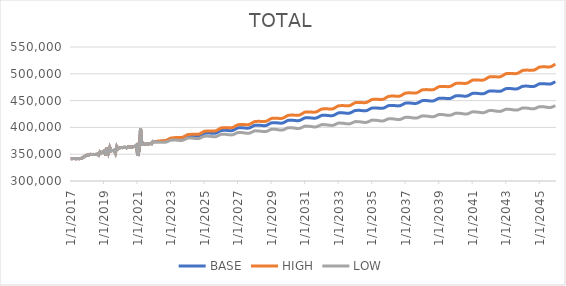
| Category | BASE | HIGH | LOW |
|---|---|---|---|
| 1/1/17 | 341414 | 341414 | 341414 |
| 2/1/17 | 341582 | 341582 | 341582 |
| 3/1/17 | 342098 | 342098 | 342098 |
| 4/1/17 | 341754 | 341754 | 341754 |
| 5/1/17 | 341351 | 341351 | 341351 |
| 6/1/17 | 341951 | 341951 | 341951 |
| 7/1/17 | 341513 | 341513 | 341513 |
| 8/1/17 | 342066 | 342066 | 342066 |
| 9/1/17 | 342562 | 342562 | 342562 |
| 10/1/17 | 344309 | 344309 | 344309 |
| 11/1/17 | 346057 | 346057 | 346057 |
| 12/1/17 | 347147 | 347147 | 347147 |
| 1/1/18 | 348705 | 348705 | 348705 |
| 2/1/18 | 348555 | 348555 | 348555 |
| 3/1/18 | 349740 | 349740 | 349740 |
| 4/1/18 | 349401 | 349401 | 349401 |
| 5/1/18 | 349702 | 349702 | 349702 |
| 6/1/18 | 349418 | 349418 | 349418 |
| 7/1/18 | 349708 | 349708 | 349708 |
| 8/1/18 | 350136 | 350136 | 350136 |
| 9/1/18 | 348254 | 348254 | 348254 |
| 10/1/18 | 354458 | 354458 | 354458 |
| 11/1/18 | 352362 | 352362 | 352362 |
| 12/1/18 | 354728.273 | 354728.273 | 354728.273 |
| 1/1/19 | 356267 | 356267 | 356267 |
| 2/1/19 | 347960 | 347960 | 347960 |
| 3/1/19 | 362067 | 362067 | 362067 |
| 4/1/19 | 352798 | 352798 | 352798 |
| 5/1/19 | 362711 | 362711 | 362711 |
| 6/1/19 | 356136 | 356136 | 356136 |
| 7/1/19 | 356922 | 356922 | 356922 |
| 8/1/19 | 357506 | 357506 | 357506 |
| 9/1/19 | 352009 | 352009 | 352009 |
| 10/1/19 | 364300 | 364300 | 364300 |
| 11/1/19 | 360032 | 360032 | 360032 |
| 12/1/19 | 361445 | 361445 | 361445 |
| 1/1/20 | 362653 | 362653 | 362653 |
| 2/1/20 | 362205 | 362205 | 362205 |
| 3/1/20 | 362824 | 362824 | 362824 |
| 4/1/20 | 362974 | 362974 | 362974 |
| 5/1/20 | 361790 | 361790 | 361790 |
| 6/1/20 | 363908 | 363908 | 363908 |
| 7/1/20 | 363529 | 363529 | 363529 |
| 8/1/20 | 363593 | 363593 | 363593 |
| 9/1/20 | 363024 | 363024 | 363024 |
| 10/1/20 | 364200 | 364200 | 364200 |
| 11/1/20 | 364655 | 364655 | 364655 |
| 12/1/20 | 366796 | 366796 | 366796 |
| 1/1/21 | 346820.667 | 346820.667 | 346820.667 |
| 2/1/21 | 357845.667 | 357845.667 | 357845.667 |
| 3/1/21 | 398262.667 | 398262.667 | 398262.667 |
| 4/1/21 | 368419 | 368419 | 368419 |
| 5/1/21 | 367947 | 367947 | 367947 |
| 6/1/21 | 368967 | 368967 | 368967 |
| 7/1/21 | 368718 | 368718 | 368718 |
| 8/1/21 | 369034 | 369034 | 369034 |
| 9/1/21 | 369008 | 369008 | 369008 |
| 10/1/21 | 370222 | 370222 | 370222 |
| 11/1/21 | 369350 | 369350 | 369350 |
| 12/1/21 | 373803 | 373803 | 373803 |
| 1/1/22 | 373133.5 | 373133.5 | 373133.5 |
| 2/1/22 | 373162.5 | 373162.5 | 373162.5 |
| 3/1/22 | 373470.167 | 374216.193 | 372347.744 |
| 4/1/22 | 373796.427 | 374626.585 | 372547.515 |
| 5/1/22 | 373851.375 | 374765.947 | 372477.992 |
| 6/1/22 | 374037.883 | 375036.261 | 372537.887 |
| 7/1/22 | 373970.024 | 375052.668 | 372345.532 |
| 8/1/22 | 374041.579 | 375206.751 | 372289.741 |
| 9/1/22 | 374205.28 | 375453.565 | 372325.433 |
| 10/1/22 | 375318.473 | 376656.25 | 373308.65 |
| 11/1/22 | 376446.98 | 377873.654 | 374306.651 |
| 12/1/22 | 377803.884 | 379320.353 | 375529.693 |
| 1/1/23 | 378685.656 | 380290.779 | 376279.505 |
| 2/1/23 | 378755.328 | 380445.568 | 376222.46 |
| 3/1/23 | 379025.191 | 380802.195 | 376363.599 |
| 4/1/23 | 379146.206 | 381008.42 | 376356.531 |
| 5/1/23 | 379103.931 | 381051.451 | 376188.385 |
| 6/1/23 | 378934.975 | 380966.514 | 375893.281 |
| 7/1/23 | 378842.065 | 380927.054 | 375726.708 |
| 8/1/23 | 378881.929 | 381051.468 | 375637.76 |
| 9/1/23 | 379192.487 | 381448.757 | 375817.094 |
| 10/1/23 | 380299.033 | 382648.851 | 376788.299 |
| 11/1/23 | 381633.201 | 384077.493 | 377984.619 |
| 12/1/23 | 383091.776 | 385631.745 | 379302.265 |
| 1/1/24 | 383967.878 | 386599.967 | 380041.899 |
| 2/1/24 | 384062.076 | 386780.961 | 380007.704 |
| 3/1/24 | 384305.309 | 387112.803 | 380119.326 |
| 4/1/24 | 384376.314 | 387270.679 | 380060.768 |
| 5/1/24 | 384237.635 | 387217.909 | 379796.258 |
| 6/1/24 | 384020.824 | 387086.201 | 379452.872 |
| 7/1/24 | 383874.007 | 386994.051 | 379231.654 |
| 8/1/24 | 383936.571 | 387143.386 | 379163.223 |
| 9/1/24 | 384271.777 | 387568.011 | 379364.331 |
| 10/1/24 | 385422.033 | 388816.554 | 380373.284 |
| 11/1/24 | 386812.974 | 390307.196 | 381619.63 |
| 12/1/24 | 388315.719 | 391911.214 | 382974.304 |
| 1/1/25 | 389190.56 | 392881.725 | 383708.318 |
| 2/1/25 | 389298.051 | 393077.853 | 383685.706 |
| 3/1/25 | 389493.274 | 393363.214 | 383749.063 |
| 4/1/25 | 389528.247 | 393486.796 | 383653.027 |
| 5/1/25 | 389339.886 | 393385.096 | 383338.722 |
| 6/1/25 | 389092.724 | 393224.039 | 382964.688 |
| 7/1/25 | 388925.951 | 393113.259 | 382722.606 |
| 8/1/25 | 388976.503 | 393252.293 | 382640.575 |
| 9/1/25 | 389338.021 | 393706.153 | 382864.781 |
| 10/1/25 | 390522.769 | 394994.132 | 383901.995 |
| 11/1/25 | 391929.311 | 396505.219 | 385157.623 |
| 12/1/25 | 393432.283 | 398114.573 | 386506.067 |
| 1/1/26 | 394328.758 | 399110.848 | 387256.644 |
| 2/1/26 | 394406.804 | 399278.759 | 387203.752 |
| 3/1/26 | 394576.154 | 399539.913 | 387239.842 |
| 4/1/26 | 394563.062 | 399616.652 | 387095.034 |
| 5/1/26 | 394371.723 | 399513.266 | 386776.926 |
| 6/1/26 | 394077.657 | 399305.566 | 386356.651 |
| 7/1/26 | 393903.818 | 399189.311 | 386106.306 |
| 8/1/26 | 393927.307 | 399302.633 | 385996.149 |
| 9/1/26 | 394294.859 | 399765.363 | 386223.396 |
| 10/1/26 | 395464.723 | 401042.636 | 387240.58 |
| 11/1/26 | 396855.066 | 402541.964 | 388474.362 |
| 12/1/26 | 398338.285 | 404136.42 | 389797.051 |
| 1/1/27 | 399224.477 | 405126.129 | 390532.971 |
| 2/1/27 | 399256.87 | 405249.115 | 390434.31 |
| 3/1/27 | 399394.006 | 405479.518 | 390437.138 |
| 4/1/27 | 399332.016 | 405508.188 | 390243.297 |
| 5/1/27 | 399097.599 | 405361.992 | 389882.692 |
| 6/1/27 | 398767.569 | 405118.565 | 389427.213 |
| 7/1/27 | 398592.755 | 405002.777 | 389174.844 |
| 8/1/27 | 398629.231 | 405131.041 | 389075.852 |
| 9/1/27 | 398997.754 | 405597.316 | 389301.414 |
| 10/1/27 | 400171.616 | 406883.015 | 390317.141 |
| 11/1/27 | 401579.028 | 408404.513 | 391561.528 |
| 12/1/27 | 403071.151 | 410013.315 | 392886.422 |
| 1/1/28 | 403939.562 | 410988.55 | 393600.735 |
| 2/1/28 | 403970.799 | 411111.877 | 393499.793 |
| 3/1/28 | 404095.087 | 411331.017 | 393489.073 |
| 4/1/28 | 404025.004 | 411353.005 | 393286.175 |
| 5/1/28 | 403768.638 | 411185.243 | 392903.523 |
| 6/1/28 | 403449.569 | 410953.912 | 392458.553 |
| 7/1/28 | 403262.768 | 410827.2 | 392193.707 |
| 8/1/28 | 403303.258 | 410961.246 | 392097.135 |
| 9/1/28 | 403672.775 | 411431.013 | 392321.159 |
| 10/1/28 | 404858.628 | 412733.465 | 393343.087 |
| 11/1/28 | 406268.032 | 414261.794 | 394583.396 |
| 12/1/28 | 407760.188 | 415875.848 | 395901.965 |
| 1/1/29 | 408617.476 | 416843.388 | 396601.742 |
| 2/1/29 | 408647.762 | 416967.204 | 396498.797 |
| 3/1/29 | 408758.984 | 417174.673 | 396474.031 |
| 4/1/29 | 408687.963 | 417197.286 | 396269.084 |
| 5/1/29 | 408429.559 | 417028.261 | 395883.766 |
| 6/1/29 | 408105.513 | 416792.573 | 395434.044 |
| 7/1/29 | 407918.694 | 416667.195 | 395168.27 |
| 8/1/29 | 407960.19 | 416803.897 | 395071.34 |
| 9/1/29 | 408333.712 | 417280.437 | 395296.54 |
| 10/1/29 | 409519.565 | 418587.374 | 396313.102 |
| 11/1/29 | 410922.964 | 420114.302 | 397541.72 |
| 12/1/29 | 412404.116 | 421722.218 | 398843.457 |
| 1/1/30 | 413264.605 | 422696.806 | 399542.505 |
| 2/1/30 | 413281.875 | 422808.604 | 399426.108 |
| 3/1/30 | 413388.118 | 423012.677 | 399395.176 |
| 4/1/30 | 413307.068 | 423026.384 | 399179.653 |
| 5/1/30 | 413051.69 | 422861.322 | 398797.052 |
| 6/1/30 | 412715.628 | 422613.9 | 398335.962 |
| 7/1/30 | 412539.821 | 422501.326 | 398079.783 |
| 8/1/30 | 412581.307 | 422639.752 | 397981.364 |
| 9/1/30 | 412959.832 | 423124.202 | 398208.164 |
| 10/1/30 | 414146.686 | 424436.693 | 399220.796 |
| 11/1/30 | 415551.087 | 425969.537 | 400444.421 |
| 12/1/30 | 417033.236 | 427583.761 | 401740.81 |
| 1/1/31 | 417891.799 | 428560.167 | 402433.674 |
| 2/1/31 | 417905.075 | 428669.244 | 402312.504 |
| 3/1/31 | 418013.311 | 428877.126 | 402282.126 |
| 4/1/31 | 417931.271 | 428891.28 | 402064.675 |
| 5/1/31 | 417672.881 | 428723.92 | 401679.036 |
| 6/1/31 | 417343.829 | 428484.514 | 401224.712 |
| 7/1/31 | 417164.015 | 428369.214 | 400963.8 |
| 8/1/31 | 417211.507 | 428515.647 | 400869.616 |
| 9/1/31 | 417587.028 | 428999.677 | 401090.379 |
| 10/1/31 | 418772.883 | 430315.776 | 402097.142 |
| 11/1/31 | 420179.284 | 431855.608 | 403316.721 |
| 12/1/31 | 421660.434 | 433474.156 | 404605.829 |
| 1/1/32 | 422515.997 | 434451.166 | 405291.668 |
| 2/1/32 | 422531.271 | 434563.739 | 405171.466 |
| 3/1/32 | 422637.51 | 434771.299 | 405137.821 |
| 4/1/32 | 422555.467 | 434786.993 | 404919.338 |
| 5/1/32 | 422297.081 | 434620.385 | 404533.651 |
| 6/1/32 | 421975.024 | 434389.074 | 404085.14 |
| 7/1/32 | 421791.214 | 434271.082 | 403819.534 |
| 8/1/32 | 421833.703 | 434414.111 | 403719.187 |
| 9/1/32 | 422209.227 | 434900.867 | 403937.408 |
| 10/1/32 | 423395.08 | 436221.6 | 404938.833 |
| 11/1/32 | 424796.481 | 437761.209 | 406147.723 |
| 12/1/32 | 426276.632 | 439384.048 | 407429.745 |
| 1/1/33 | 427129.241 | 440361.705 | 408108.701 |
| 2/1/33 | 427144.515 | 440475.712 | 407987.588 |
| 3/1/33 | 427244.753 | 440678.757 | 407946.994 |
| 4/1/33 | 427163.711 | 440696.963 | 407728.597 |
| 5/1/33 | 426906.324 | 440532.268 | 407343.674 |
| 6/1/33 | 426577.269 | 440294.445 | 406889.488 |
| 7/1/33 | 426400.457 | 440185.244 | 406629.586 |
| 8/1/33 | 426439.947 | 440327.002 | 406524.913 |
| 9/1/33 | 426815.469 | 440816.607 | 406740.389 |
| 10/1/33 | 427999.324 | 442139.939 | 407734.537 |
| 11/1/33 | 429400.724 | 443684.475 | 408937.616 |
| 12/1/33 | 430876.875 | 445308.452 | 410209.736 |
| 1/1/34 | 431730.633 | 446291.189 | 410885.516 |
| 2/1/34 | 431745.908 | 446406.576 | 410763.544 |
| 3/1/34 | 431847.146 | 446612.402 | 410722.608 |
| 4/1/34 | 431762.103 | 446627.964 | 410499.441 |
| 5/1/34 | 431506.717 | 446466.239 | 410116.251 |
| 6/1/34 | 431174.661 | 446226.141 | 409659.301 |
| 7/1/34 | 430995.85 | 446116.378 | 409396.542 |
| 8/1/34 | 431037.34 | 446262.059 | 409292.279 |
| 9/1/34 | 431409.862 | 446751.372 | 409502.278 |
| 10/1/34 | 432589.716 | 448075.169 | 410487.404 |
| 11/1/34 | 433987.117 | 449620.52 | 411680.856 |
| 12/1/34 | 435465.267 | 451251.95 | 412948.666 |
| 1/1/35 | 436316.969 | 452236.347 | 413618.414 |
| 2/1/35 | 436326.244 | 452346.923 | 413489.899 |
| 3/1/35 | 436428.482 | 452555.56 | 413448.563 |
| 4/1/35 | 436343.44 | 452572.608 | 413224.504 |
| 5/1/35 | 436082.053 | 452405.474 | 412835.58 |
| 6/1/35 | 435750.998 | 452167.282 | 412379.574 |
| 7/1/35 | 435571.186 | 452057.964 | 412114.981 |
| 8/1/35 | 435611.676 | 452204.484 | 412008.324 |
| 9/1/35 | 435982.198 | 452694.508 | 412213.822 |
| 10/1/35 | 437162.053 | 454023.009 | 413193.674 |
| 11/1/35 | 438561.453 | 455575.423 | 414383.199 |
| 12/1/35 | 440036.604 | 457209.1 | 415642.163 |
| 1/1/36 | 440885.645 | 458194.465 | 416305.337 |
| 2/1/36 | 440896.932 | 458308.543 | 416177.833 |
| 3/1/36 | 440996.218 | 458515.871 | 416132.54 |
| 4/1/36 | 440915.067 | 458538.531 | 415911.19 |
| 5/1/36 | 440649.916 | 458368.315 | 415518.634 |
| 6/1/36 | 440321.23 | 458133.436 | 415064.923 |
| 7/1/36 | 440137.418 | 458021.454 | 414795.675 |
| 8/1/36 | 440175.908 | 458167.782 | 414685.691 |
| 9/1/36 | 440546.431 | 458660.604 | 414888.663 |
| 10/1/36 | 441726.285 | 459993.848 | 415863.215 |
| 11/1/36 | 443120.686 | 461545.958 | 417042.367 |
| 12/1/36 | 444597.483 | 463186.819 | 418296.778 |
| 1/1/37 | 445442.469 | 464171.744 | 418952.121 |
| 2/1/37 | 445453.755 | 464287.232 | 418823.82 |
| 3/1/37 | 445553.041 | 464496.288 | 418777.25 |
| 4/1/37 | 445468.89 | 464517.37 | 418552.216 |
| 5/1/37 | 445205.739 | 464350.238 | 418161.27 |
| 6/1/37 | 444872.588 | 464111.463 | 417703.554 |
| 7/1/37 | 444687.581 | 463999.805 | 417432.329 |
| 8/1/37 | 444726.072 | 464147.941 | 417320.977 |
| 9/1/37 | 445093.594 | 464640.429 | 417518.62 |
| 10/1/37 | 446271.448 | 465976.335 | 418486.098 |
| 11/1/37 | 447664.207 | 467531.75 | 419657.977 |
| 12/1/37 | 449138.306 | 469175.114 | 420903.878 |
| 1/1/38 | 449985.267 | 470165.987 | 421557.107 |
| 2/1/38 | 449992.553 | 470278.694 | 421424.298 |
| 3/1/38 | 450089.839 | 470487.399 | 421374.577 |
| 4/1/38 | 450003.688 | 470507.889 | 421146.921 |
| 5/1/38 | 449738.537 | 470339.525 | 420754.036 |
| 6/1/38 | 449405.386 | 470101.625 | 420296.402 |
| 7/1/38 | 449219.61 | 469990.756 | 420023.482 |
| 8/1/38 | 449253.209 | 470135.609 | 419906.234 |
| 9/1/38 | 449623.683 | 470634.138 | 420103.983 |
| 10/1/38 | 450800.656 | 471973.804 | 421065.54 |
| 11/1/38 | 452195.005 | 473535.899 | 422233.289 |
| 12/1/38 | 453668.104 | 475183.747 | 423472.254 |
| 1/1/39 | 454515.192 | 476178.603 | 424121.513 |
| 2/1/39 | 454520.479 | 476290.648 | 423985.979 |
| 3/1/39 | 454619.765 | 476503.291 | 423936.982 |
| 4/1/39 | 454529.614 | 476521.136 | 423704.683 |
| 5/1/39 | 454265.463 | 476354.716 | 423312.658 |
| 6/1/39 | 453931.312 | 476116.687 | 422854.161 |
| 7/1/39 | 453743.535 | 476005.156 | 422578.69 |
| 8/1/39 | 453779.134 | 476154.042 | 422461.884 |
| 9/1/39 | 454142.608 | 476647.956 | 422650.749 |
| 10/1/39 | 455317.582 | 477990.244 | 423605.347 |
| 11/1/39 | 456707.931 | 479553.146 | 424763.76 |
| 12/1/39 | 458179.03 | 481204.186 | 425995.115 |
| 1/1/40 | 459023.192 | 482199.792 | 426637.732 |
| 2/1/40 | 459029.478 | 482314.327 | 426502.341 |
| 3/1/40 | 459122.764 | 482522.389 | 426446.62 |
| 4/1/40 | 459031.613 | 482540.678 | 426212.565 |
| 5/1/40 | 458765.462 | 482372.957 | 425818.71 |
| 6/1/40 | 458428.311 | 482132.587 | 425357.599 |
| 7/1/40 | 458239.535 | 482021.633 | 425080.267 |
| 8/1/40 | 458273.134 | 482170.259 | 424960.271 |
| 9/1/40 | 458637.607 | 482668.134 | 425147.615 |
| 10/1/40 | 459811.581 | 484014.072 | 426096.26 |
| 11/1/40 | 461202.93 | 485583.121 | 427249.944 |
| 12/1/40 | 462671.029 | 487236.492 | 428472.601 |
| 1/1/41 | 463514.244 | 488234.891 | 429110.522 |
| 2/1/41 | 463520.531 | 488350.874 | 428974.388 |
| 3/1/41 | 463613.817 | 488560.739 | 428917.492 |
| 4/1/41 | 463526.666 | 488584.936 | 428686.229 |
| 5/1/41 | 463257.515 | 488414.894 | 428289.542 |
| 6/1/41 | 462919.363 | 488174.33 | 427827.657 |
| 7/1/41 | 462730.587 | 488065.013 | 427549.418 |
| 8/1/41 | 462764.186 | 488215.597 | 427428.107 |
| 9/1/41 | 463126.66 | 488714.259 | 427611.107 |
| 10/1/41 | 464298.634 | 490062.996 | 428552.693 |
| 11/1/41 | 465689.983 | 491637.095 | 429700.873 |
| 12/1/41 | 467158.082 | 493296.038 | 430917.611 |
| 1/1/42 | 468001.11 | 494298.25 | 431551.307 |
| 2/1/42 | 468005.396 | 494413.606 | 431412.51 |
| 3/1/42 | 468100.682 | 494627.437 | 431356.271 |
| 4/1/42 | 468007.531 | 494646.903 | 431118.579 |
| 5/1/42 | 467739.38 | 494478.959 | 430722.727 |
| 6/1/42 | 467400.229 | 494238.207 | 430260.031 |
| 7/1/42 | 467211.453 | 494130.558 | 429980.985 |
| 8/1/42 | 467247.052 | 494285.264 | 429860.054 |
| 9/1/42 | 467613.526 | 494791.135 | 430044.221 |
| 10/1/42 | 468787.499 | 496146.889 | 430982.569 |
| 11/1/42 | 470177.848 | 497725.052 | 432124.186 |
| 12/1/42 | 471648.947 | 499392.707 | 433337.853 |
| 1/1/43 | 472494.15 | 500401.264 | 433969.541 |
| 2/1/43 | 472498.436 | 500518.175 | 433829.896 |
| 3/1/43 | 472595.722 | 500736.03 | 433774.256 |
| 4/1/43 | 472506.571 | 500761.362 | 433539.434 |
| 5/1/43 | 472241.42 | 500597.584 | 433146.132 |
| 6/1/43 | 471904.269 | 500360.026 | 432685.312 |
| 7/1/43 | 471714.493 | 500252.804 | 432404.617 |
| 8/1/43 | 471746.092 | 500405.215 | 432278.657 |
| 9/1/43 | 472110.566 | 500911.825 | 432458.655 |
| 10/1/43 | 473282.539 | 502270.228 | 433390.16 |
| 11/1/43 | 474673.888 | 503854.646 | 434527.191 |
| 12/1/43 | 476143.987 | 505526.752 | 435734.198 |
| 1/1/44 | 476985.059 | 506534.747 | 436358.399 |
| 2/1/44 | 476990.345 | 506654.204 | 436218.945 |
| 3/1/44 | 477082.632 | 506868.548 | 436157.604 |
| 4/1/44 | 476990.48 | 506892.319 | 435919.217 |
| 5/1/44 | 476725.329 | 506729.449 | 435525.859 |
| 6/1/44 | 476385.178 | 506489.498 | 435062.626 |
| 7/1/44 | 476204.402 | 506394.065 | 434788.676 |
| 8/1/44 | 476243.001 | 506556.293 | 434667.561 |
| 9/1/44 | 476614.475 | 507073.763 | 434850.394 |
| 10/1/44 | 477797.449 | 508449.374 | 435786.68 |
| 11/1/44 | 479193.797 | 510044.657 | 436922.688 |
| 12/1/44 | 480671.896 | 511731.458 | 438130.827 |
| 1/1/45 | 481520.926 | 512752.475 | 438758.108 |
| 2/1/45 | 481531.212 | 512879.215 | 438622.293 |
| 3/1/45 | 481633.499 | 513106.593 | 438568.573 |
| 4/1/45 | 481550.348 | 513142.122 | 438337.066 |
| 5/1/45 | 481288.196 | 512984.017 | 437946.477 |
| 6/1/45 | 480958.045 | 512756.232 | 437492.396 |
| 7/1/45 | 480788.269 | 512674.735 | 437227.788 |
| 8/1/45 | 480835.868 | 512849.189 | 437113.434 |
| 9/1/45 | 481216.342 | 513379.871 | 437302.665 |
| 10/1/45 | 482408.316 | 514770.505 | 438241.949 |
| 11/1/45 | 483816.665 | 516384.412 | 439383.025 |
| 12/1/45 | 485301.763 | 518084.905 | 440591.59 |